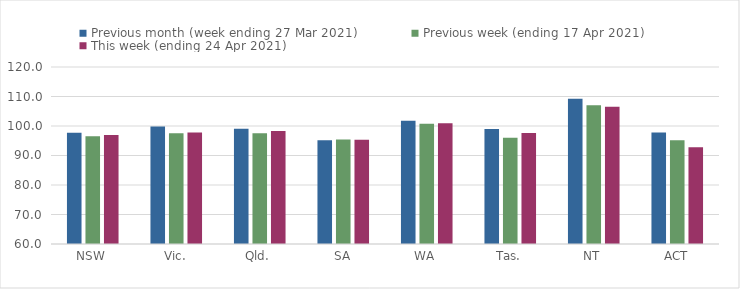
| Category | Previous month (week ending 27 Mar 2021) | Previous week (ending 17 Apr 2021) | This week (ending 24 Apr 2021) |
|---|---|---|---|
| NSW | 97.67 | 96.51 | 96.97 |
| Vic. | 99.82 | 97.55 | 97.8 |
| Qld. | 99.11 | 97.55 | 98.32 |
| SA | 95.16 | 95.43 | 95.37 |
| WA | 101.74 | 100.76 | 100.95 |
| Tas. | 98.96 | 96.01 | 97.66 |
| NT | 109.25 | 107.05 | 106.49 |
| ACT | 97.77 | 95.19 | 92.83 |